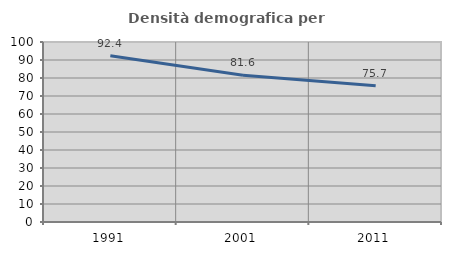
| Category | Densità demografica |
|---|---|
| 1991.0 | 92.403 |
| 2001.0 | 81.585 |
| 2011.0 | 75.727 |